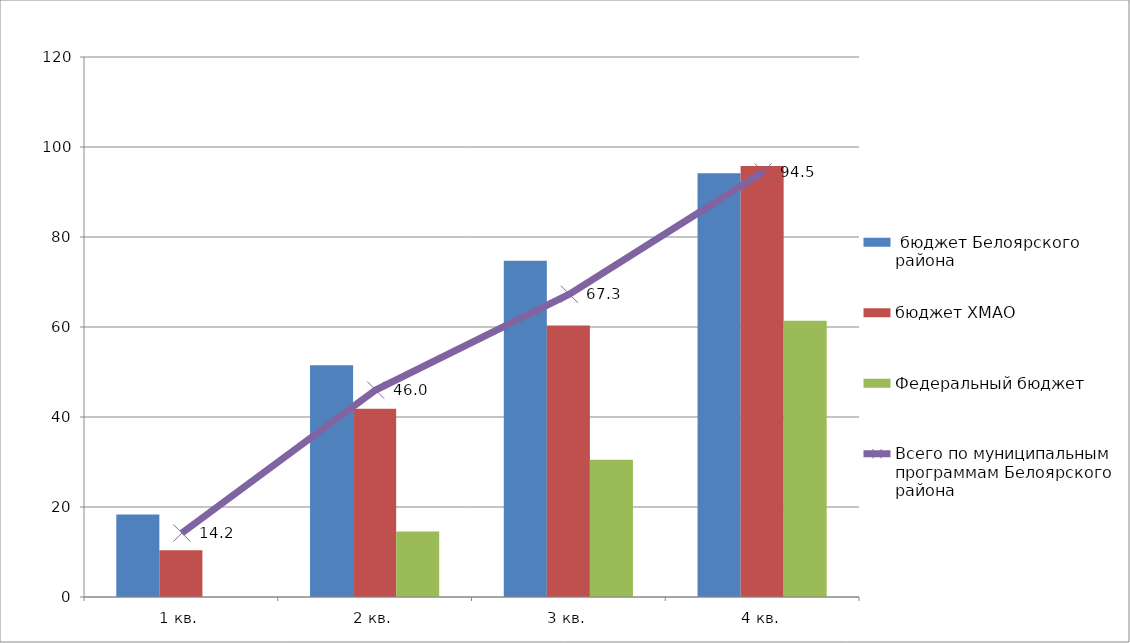
| Category |  бюджет Белоярского района | бюджет ХМАО | Федеральный бюджет |
|---|---|---|---|
| 1 кв. | 18.331 | 10.413 | 0 |
| 2 кв. | 51.513 | 41.834 | 14.564 |
| 3 кв. | 74.749 | 60.312 | 30.496 |
| 4 кв. | 94.15 | 95.803 | 61.369 |